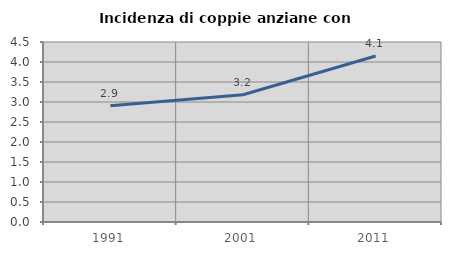
| Category | Incidenza di coppie anziane con figli |
|---|---|
| 1991.0 | 2.907 |
| 2001.0 | 3.182 |
| 2011.0 | 4.149 |